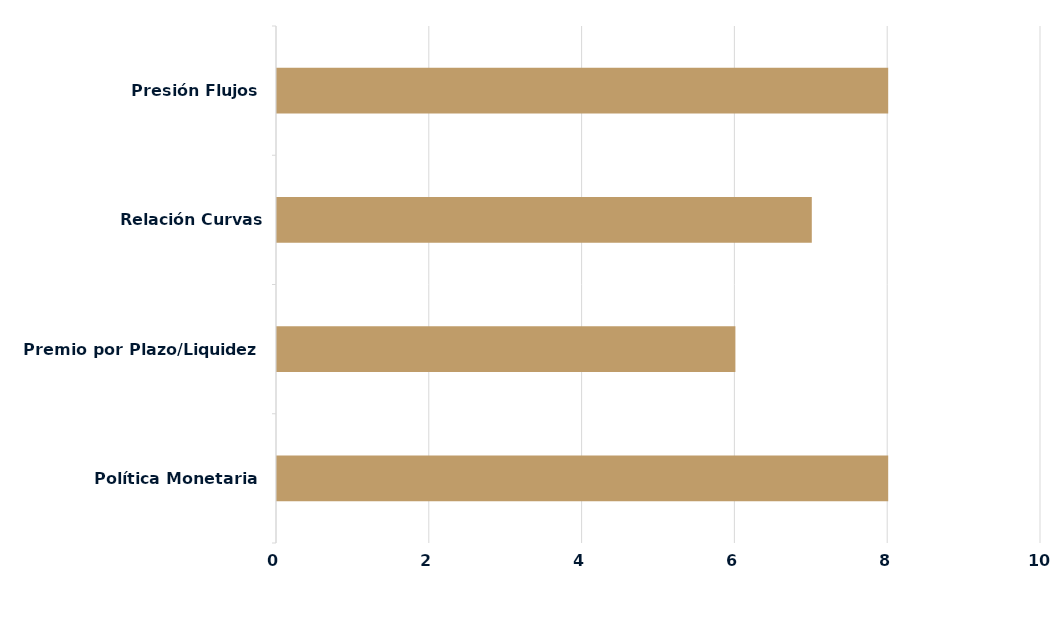
| Category | Series 0 |
|---|---|
| Política Monetaria | 8 |
| Premio por Plazo/Liquidez | 6 |
| Relación Curvas Internacionales | 7 |
| Presión Flujos | 8 |